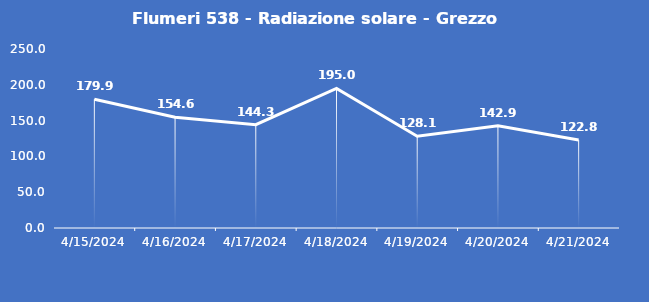
| Category | Flumeri 538 - Radiazione solare - Grezzo (W/m2) |
|---|---|
| 4/15/24 | 179.9 |
| 4/16/24 | 154.6 |
| 4/17/24 | 144.3 |
| 4/18/24 | 195 |
| 4/19/24 | 128.1 |
| 4/20/24 | 142.9 |
| 4/21/24 | 122.8 |